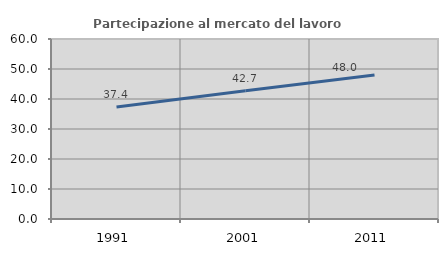
| Category | Partecipazione al mercato del lavoro  femminile |
|---|---|
| 1991.0 | 37.364 |
| 2001.0 | 42.716 |
| 2011.0 | 48.026 |